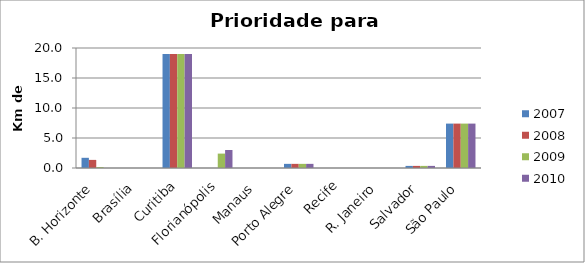
| Category | 2007 | 2008 | 2009 | 2010 |
|---|---|---|---|---|
| B. Horizonte | 1.7 | 1.35 | 0.15 | 0 |
| Brasília | 0 | 0 | 0 | 0 |
| Curitiba | 19 | 19 | 19 | 19 |
| Florianópolis | 0 | 0 | 2.4 | 3 |
| Manaus | 0 | 0 | 0 | 0 |
| Porto Alegre | 0.69 | 0.69 | 0.69 | 0.69 |
| Recife | 0 | 0 | 0 | 0 |
| R. Janeiro | 0 | 0 | 0 | 0 |
| Salvador | 0.35 | 0.35 | 0.35 | 0.35 |
| São Paulo | 7.4 | 7.4 | 7.4 | 7.4 |